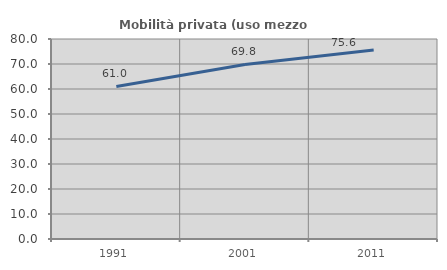
| Category | Mobilità privata (uso mezzo privato) |
|---|---|
| 1991.0 | 61.018 |
| 2001.0 | 69.804 |
| 2011.0 | 75.624 |